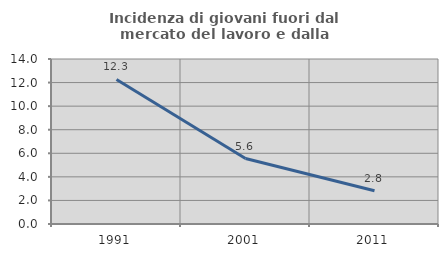
| Category | Incidenza di giovani fuori dal mercato del lavoro e dalla formazione  |
|---|---|
| 1991.0 | 12.264 |
| 2001.0 | 5.556 |
| 2011.0 | 2.817 |